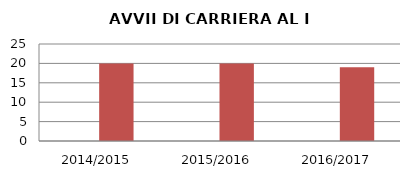
| Category | ANNO | NUMERO |
|---|---|---|
| 2014/2015 | 0 | 20 |
| 2015/2016 | 0 | 20 |
| 2016/2017 | 0 | 19 |